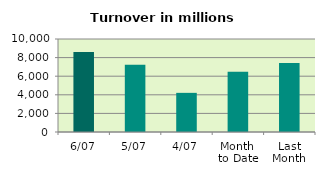
| Category | Series 0 |
|---|---|
| 6/07 | 8599.253 |
| 5/07 | 7240.967 |
| 4/07 | 4209.19 |
| Month 
to Date | 6491.88 |
| Last
Month | 7424.465 |